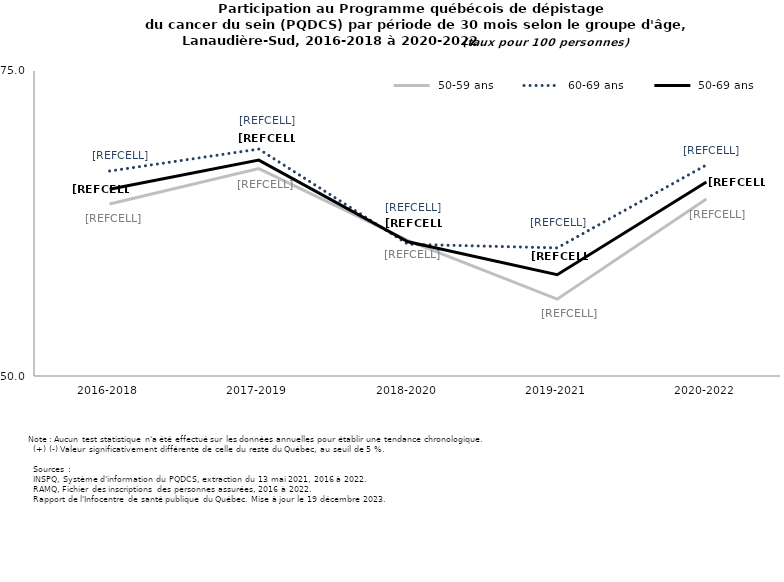
| Category |  50-59 ans |  60-69 ans |  50-69 ans |
|---|---|---|---|
| 2016-2018 | 64.1 | 66.8 | 65.3 |
| 2017-2019 | 67 | 68.6 | 67.7 |
| 2018-2020 | 61.1 | 60.8 | 61 |
| 2019-2021 | 56.3 | 60.5 | 58.3 |
| 2020-2022 | 64.5 | 67.3 | 65.9 |